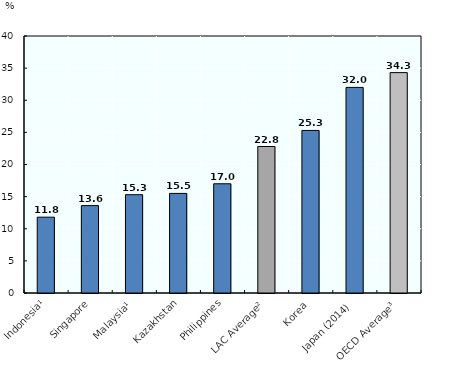
| Category | Tax-to-GDP ratio |
|---|---|
| Indonesia¹ | 11.8 |
| Singapore | 13.6 |
| Malaysia¹ | 15.3 |
| Kazakhstan | 15.5 |
| Philippines | 17 |
| LAC Average² | 22.8 |
| Korea | 25.3 |
| Japan (2014) | 32 |
| OECD Average³ | 34.3 |